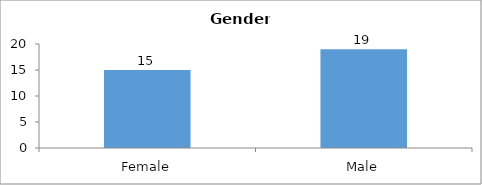
| Category | Gender |
|---|---|
| Female | 15 |
| Male | 19 |